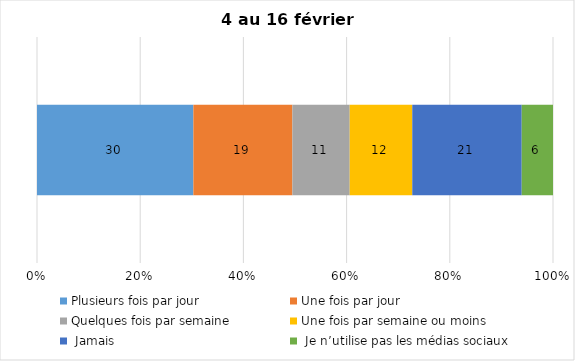
| Category | Plusieurs fois par jour | Une fois par jour | Quelques fois par semaine   | Une fois par semaine ou moins   |  Jamais   |  Je n’utilise pas les médias sociaux |
|---|---|---|---|---|---|---|
| 0 | 30 | 19 | 11 | 12 | 21 | 6 |